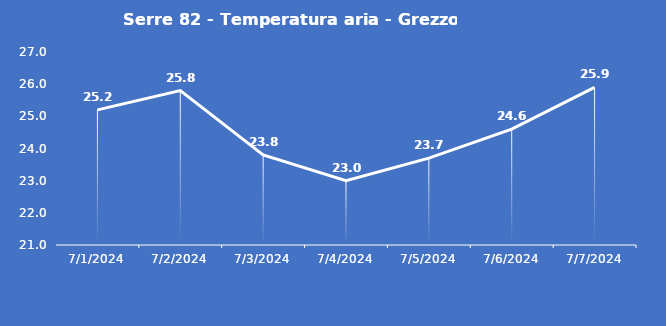
| Category | Serre 82 - Temperatura aria - Grezzo (°C) |
|---|---|
| 7/1/24 | 25.2 |
| 7/2/24 | 25.8 |
| 7/3/24 | 23.8 |
| 7/4/24 | 23 |
| 7/5/24 | 23.7 |
| 7/6/24 | 24.6 |
| 7/7/24 | 25.9 |